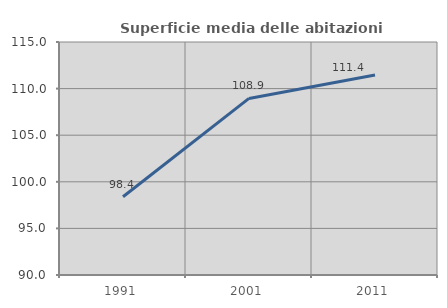
| Category | Superficie media delle abitazioni occupate |
|---|---|
| 1991.0 | 98.398 |
| 2001.0 | 108.947 |
| 2011.0 | 111.449 |